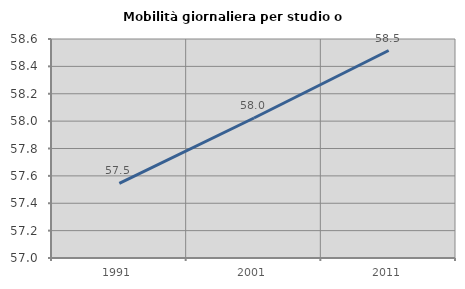
| Category | Mobilità giornaliera per studio o lavoro |
|---|---|
| 1991.0 | 57.545 |
| 2001.0 | 58.023 |
| 2011.0 | 58.516 |